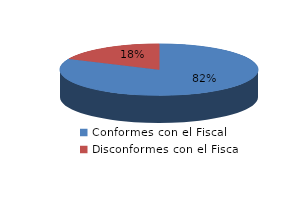
| Category | Series 0 |
|---|---|
| 0 | 284 |
| 1 | 63 |